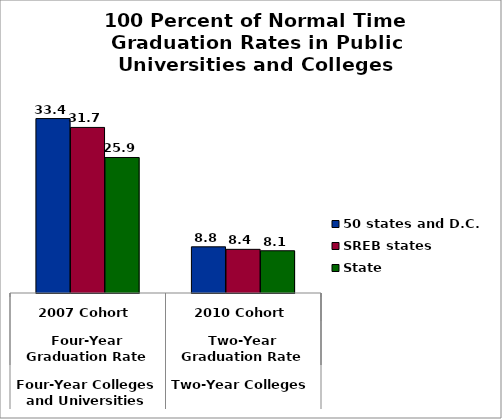
| Category | 50 states and D.C. | SREB states | State |
|---|---|---|---|
| 0 | 33.384 | 31.688 | 25.933 |
| 1 | 8.837 | 8.357 | 8.085 |